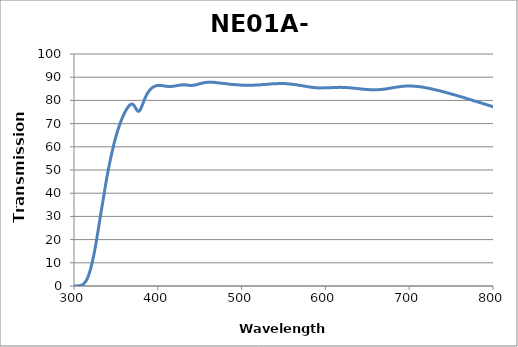
| Category | Series 0 |
|---|---|
| 850.0 | 72.008 |
| 849.0 | 72.01 |
| 848.0 | 72.136 |
| 847.0 | 72.237 |
| 846.0 | 72.364 |
| 845.0 | 72.419 |
| 844.0 | 72.605 |
| 843.0 | 72.618 |
| 842.0 | 72.792 |
| 841.0 | 72.93 |
| 840.0 | 72.947 |
| 839.0 | 73.055 |
| 838.0 | 73.143 |
| 837.0 | 73.235 |
| 836.0 | 73.36 |
| 835.0 | 73.478 |
| 834.0 | 73.596 |
| 833.0 | 73.716 |
| 832.0 | 73.806 |
| 831.0 | 73.865 |
| 830.0 | 74.009 |
| 829.0 | 74.136 |
| 828.0 | 74.208 |
| 827.0 | 74.345 |
| 826.0 | 74.465 |
| 825.0 | 74.571 |
| 824.0 | 74.636 |
| 823.0 | 74.772 |
| 822.0 | 74.839 |
| 821.0 | 74.987 |
| 820.0 | 75.114 |
| 819.0 | 75.181 |
| 818.0 | 75.324 |
| 817.0 | 75.419 |
| 816.0 | 75.488 |
| 815.0 | 75.642 |
| 814.0 | 75.739 |
| 813.0 | 75.859 |
| 812.0 | 75.975 |
| 811.0 | 76.096 |
| 810.0 | 76.162 |
| 809.0 | 76.309 |
| 808.0 | 76.4 |
| 807.0 | 76.532 |
| 806.0 | 76.663 |
| 805.0 | 76.728 |
| 804.0 | 76.86 |
| 803.0 | 76.959 |
| 802.0 | 77.062 |
| 801.0 | 77.198 |
| 800.0 | 77.286 |
| 799.0 | 77.39 |
| 798.0 | 77.491 |
| 797.0 | 77.641 |
| 796.0 | 77.725 |
| 795.0 | 77.826 |
| 794.0 | 77.989 |
| 793.0 | 78.068 |
| 792.0 | 78.208 |
| 791.0 | 78.32 |
| 790.0 | 78.408 |
| 789.0 | 78.537 |
| 788.0 | 78.647 |
| 787.0 | 78.751 |
| 786.0 | 78.88 |
| 785.0 | 79.005 |
| 784.0 | 79.091 |
| 783.0 | 79.21 |
| 782.0 | 79.334 |
| 781.0 | 79.436 |
| 780.0 | 79.555 |
| 779.0 | 79.66 |
| 778.0 | 79.718 |
| 777.0 | 79.887 |
| 776.0 | 79.963 |
| 775.0 | 80.111 |
| 774.0 | 80.223 |
| 773.0 | 80.343 |
| 772.0 | 80.422 |
| 771.0 | 80.528 |
| 770.0 | 80.68 |
| 769.0 | 80.766 |
| 768.0 | 80.894 |
| 767.0 | 81.004 |
| 766.0 | 81.084 |
| 765.0 | 81.231 |
| 764.0 | 81.326 |
| 763.0 | 81.448 |
| 762.0 | 81.546 |
| 761.0 | 81.656 |
| 760.0 | 81.72 |
| 759.0 | 81.859 |
| 758.0 | 81.979 |
| 757.0 | 82.059 |
| 756.0 | 82.19 |
| 755.0 | 82.285 |
| 754.0 | 82.372 |
| 753.0 | 82.506 |
| 752.0 | 82.585 |
| 751.0 | 82.677 |
| 750.0 | 82.809 |
| 749.0 | 82.908 |
| 748.0 | 82.965 |
| 747.0 | 83.098 |
| 746.0 | 83.2 |
| 745.0 | 83.304 |
| 744.0 | 83.394 |
| 743.0 | 83.504 |
| 742.0 | 83.563 |
| 741.0 | 83.697 |
| 740.0 | 83.787 |
| 739.0 | 83.881 |
| 738.0 | 83.991 |
| 737.0 | 84.072 |
| 736.0 | 84.13 |
| 735.0 | 84.246 |
| 734.0 | 84.344 |
| 733.0 | 84.411 |
| 732.0 | 84.512 |
| 731.0 | 84.571 |
| 730.0 | 84.654 |
| 729.0 | 84.765 |
| 728.0 | 84.846 |
| 727.0 | 84.927 |
| 726.0 | 84.991 |
| 725.0 | 85.121 |
| 724.0 | 85.166 |
| 723.0 | 85.266 |
| 722.0 | 85.301 |
| 721.0 | 85.352 |
| 720.0 | 85.443 |
| 719.0 | 85.499 |
| 718.0 | 85.54 |
| 717.0 | 85.629 |
| 716.0 | 85.719 |
| 715.0 | 85.758 |
| 714.0 | 85.832 |
| 713.0 | 85.846 |
| 712.0 | 85.867 |
| 711.0 | 85.945 |
| 710.0 | 85.987 |
| 709.0 | 86.017 |
| 708.0 | 86.056 |
| 707.0 | 86.073 |
| 706.0 | 86.09 |
| 705.0 | 86.139 |
| 704.0 | 86.165 |
| 703.0 | 86.174 |
| 702.0 | 86.202 |
| 701.0 | 86.189 |
| 700.0 | 86.199 |
| 699.0 | 86.218 |
| 698.0 | 86.214 |
| 697.0 | 86.192 |
| 696.0 | 86.171 |
| 695.0 | 86.153 |
| 694.0 | 86.103 |
| 693.0 | 86.088 |
| 692.0 | 86.085 |
| 691.0 | 86.032 |
| 690.0 | 86.012 |
| 689.0 | 85.972 |
| 688.0 | 85.895 |
| 687.0 | 85.817 |
| 686.0 | 85.801 |
| 685.0 | 85.763 |
| 684.0 | 85.689 |
| 683.0 | 85.618 |
| 682.0 | 85.544 |
| 681.0 | 85.48 |
| 680.0 | 85.443 |
| 679.0 | 85.391 |
| 678.0 | 85.294 |
| 677.0 | 85.252 |
| 676.0 | 85.172 |
| 675.0 | 85.101 |
| 674.0 | 85.051 |
| 673.0 | 85.001 |
| 672.0 | 84.953 |
| 671.0 | 84.881 |
| 670.0 | 84.826 |
| 669.0 | 84.791 |
| 668.0 | 84.773 |
| 667.0 | 84.746 |
| 666.0 | 84.693 |
| 665.0 | 84.66 |
| 664.0 | 84.633 |
| 663.0 | 84.608 |
| 662.0 | 84.607 |
| 661.0 | 84.587 |
| 660.0 | 84.558 |
| 659.0 | 84.601 |
| 658.0 | 84.588 |
| 657.0 | 84.563 |
| 656.0 | 84.592 |
| 655.0 | 84.601 |
| 654.0 | 84.607 |
| 653.0 | 84.633 |
| 652.0 | 84.64 |
| 651.0 | 84.68 |
| 650.0 | 84.729 |
| 649.0 | 84.706 |
| 648.0 | 84.726 |
| 647.0 | 84.796 |
| 646.0 | 84.803 |
| 645.0 | 84.825 |
| 644.0 | 84.883 |
| 643.0 | 84.92 |
| 642.0 | 84.941 |
| 641.0 | 84.988 |
| 640.0 | 85.023 |
| 639.0 | 85.06 |
| 638.0 | 85.125 |
| 637.0 | 85.16 |
| 636.0 | 85.19 |
| 635.0 | 85.242 |
| 634.0 | 85.248 |
| 633.0 | 85.282 |
| 632.0 | 85.35 |
| 631.0 | 85.374 |
| 630.0 | 85.407 |
| 629.0 | 85.459 |
| 628.0 | 85.455 |
| 627.0 | 85.482 |
| 626.0 | 85.532 |
| 625.0 | 85.555 |
| 624.0 | 85.581 |
| 623.0 | 85.583 |
| 622.0 | 85.582 |
| 621.0 | 85.592 |
| 620.0 | 85.601 |
| 619.0 | 85.617 |
| 618.0 | 85.623 |
| 617.0 | 85.628 |
| 616.0 | 85.595 |
| 615.0 | 85.569 |
| 614.0 | 85.593 |
| 613.0 | 85.573 |
| 612.0 | 85.554 |
| 611.0 | 85.569 |
| 610.0 | 85.536 |
| 609.0 | 85.518 |
| 608.0 | 85.537 |
| 607.0 | 85.495 |
| 606.0 | 85.481 |
| 605.0 | 85.496 |
| 604.0 | 85.441 |
| 603.0 | 85.423 |
| 602.0 | 85.446 |
| 601.0 | 85.422 |
| 600.0 | 85.431 |
| 599.0 | 85.424 |
| 598.0 | 85.405 |
| 597.0 | 85.385 |
| 596.0 | 85.407 |
| 595.0 | 85.39 |
| 594.0 | 85.381 |
| 593.0 | 85.396 |
| 592.0 | 85.384 |
| 591.0 | 85.396 |
| 590.0 | 85.459 |
| 589.0 | 85.461 |
| 588.0 | 85.491 |
| 587.0 | 85.531 |
| 586.0 | 85.535 |
| 585.0 | 85.585 |
| 584.0 | 85.66 |
| 583.0 | 85.677 |
| 582.0 | 85.722 |
| 581.0 | 85.799 |
| 580.0 | 85.832 |
| 579.0 | 85.883 |
| 578.0 | 85.957 |
| 577.0 | 86.028 |
| 576.0 | 86.105 |
| 575.0 | 86.148 |
| 574.0 | 86.203 |
| 573.0 | 86.259 |
| 572.0 | 86.341 |
| 571.0 | 86.391 |
| 570.0 | 86.425 |
| 569.0 | 86.518 |
| 568.0 | 86.565 |
| 567.0 | 86.592 |
| 566.0 | 86.701 |
| 565.0 | 86.731 |
| 564.0 | 86.787 |
| 563.0 | 86.874 |
| 562.0 | 86.877 |
| 561.0 | 86.936 |
| 560.0 | 86.936 |
| 559.0 | 87.012 |
| 558.0 | 87.068 |
| 557.0 | 87.072 |
| 556.0 | 87.129 |
| 555.0 | 87.156 |
| 554.0 | 87.146 |
| 553.0 | 87.181 |
| 552.0 | 87.22 |
| 551.0 | 87.24 |
| 550.0 | 87.257 |
| 549.0 | 87.272 |
| 548.0 | 87.257 |
| 547.0 | 87.255 |
| 546.0 | 87.303 |
| 545.0 | 87.277 |
| 544.0 | 87.265 |
| 543.0 | 87.265 |
| 542.0 | 87.197 |
| 541.0 | 87.211 |
| 540.0 | 87.219 |
| 539.0 | 87.199 |
| 538.0 | 87.209 |
| 537.0 | 87.151 |
| 536.0 | 87.121 |
| 535.0 | 87.085 |
| 534.0 | 87.084 |
| 533.0 | 87.076 |
| 532.0 | 87.012 |
| 531.0 | 86.983 |
| 530.0 | 86.935 |
| 529.0 | 86.888 |
| 528.0 | 86.916 |
| 527.0 | 86.873 |
| 526.0 | 86.844 |
| 525.0 | 86.821 |
| 524.0 | 86.733 |
| 523.0 | 86.731 |
| 522.0 | 86.733 |
| 521.0 | 86.657 |
| 520.0 | 86.645 |
| 519.0 | 86.649 |
| 518.0 | 86.588 |
| 517.0 | 86.617 |
| 516.0 | 86.603 |
| 515.0 | 86.552 |
| 514.0 | 86.56 |
| 513.0 | 86.537 |
| 512.0 | 86.525 |
| 511.0 | 86.48 |
| 510.0 | 86.561 |
| 509.0 | 86.511 |
| 508.0 | 86.525 |
| 507.0 | 86.541 |
| 506.0 | 86.483 |
| 505.0 | 86.542 |
| 504.0 | 86.596 |
| 503.0 | 86.516 |
| 502.0 | 86.585 |
| 501.0 | 86.569 |
| 500.0 | 86.569 |
| 499.0 | 86.624 |
| 498.0 | 86.694 |
| 497.0 | 86.647 |
| 496.0 | 86.708 |
| 495.0 | 86.74 |
| 494.0 | 86.716 |
| 493.0 | 86.745 |
| 492.0 | 86.841 |
| 491.0 | 86.801 |
| 490.0 | 86.902 |
| 489.0 | 86.896 |
| 488.0 | 86.896 |
| 487.0 | 86.977 |
| 486.0 | 87.018 |
| 485.0 | 86.999 |
| 484.0 | 87.107 |
| 483.0 | 87.105 |
| 482.0 | 87.15 |
| 481.0 | 87.186 |
| 480.0 | 87.265 |
| 479.0 | 87.258 |
| 478.0 | 87.325 |
| 477.0 | 87.38 |
| 476.0 | 87.383 |
| 475.0 | 87.435 |
| 474.0 | 87.51 |
| 473.0 | 87.541 |
| 472.0 | 87.561 |
| 471.0 | 87.637 |
| 470.0 | 87.628 |
| 469.0 | 87.685 |
| 468.0 | 87.788 |
| 467.0 | 87.732 |
| 466.0 | 87.831 |
| 465.0 | 87.796 |
| 464.0 | 87.784 |
| 463.0 | 87.819 |
| 462.0 | 87.828 |
| 461.0 | 87.829 |
| 460.0 | 87.785 |
| 459.0 | 87.814 |
| 458.0 | 87.714 |
| 457.0 | 87.705 |
| 456.0 | 87.675 |
| 455.0 | 87.584 |
| 454.0 | 87.537 |
| 453.0 | 87.447 |
| 452.0 | 87.354 |
| 451.0 | 87.246 |
| 450.0 | 87.196 |
| 449.0 | 87.053 |
| 448.0 | 86.99 |
| 447.0 | 86.904 |
| 446.0 | 86.742 |
| 445.0 | 86.727 |
| 444.0 | 86.612 |
| 443.0 | 86.545 |
| 442.0 | 86.518 |
| 441.0 | 86.488 |
| 440.0 | 86.434 |
| 439.0 | 86.427 |
| 438.0 | 86.516 |
| 437.0 | 86.46 |
| 436.0 | 86.574 |
| 435.0 | 86.61 |
| 434.0 | 86.602 |
| 433.0 | 86.626 |
| 432.0 | 86.729 |
| 431.0 | 86.652 |
| 430.0 | 86.708 |
| 429.0 | 86.703 |
| 428.0 | 86.606 |
| 427.0 | 86.643 |
| 426.0 | 86.562 |
| 425.0 | 86.474 |
| 424.0 | 86.466 |
| 423.0 | 86.374 |
| 422.0 | 86.347 |
| 421.0 | 86.269 |
| 420.0 | 86.178 |
| 419.0 | 86.137 |
| 418.0 | 86.076 |
| 417.0 | 86.048 |
| 416.0 | 86.033 |
| 415.0 | 85.968 |
| 414.0 | 85.992 |
| 413.0 | 85.956 |
| 412.0 | 85.986 |
| 411.0 | 86.051 |
| 410.0 | 86.083 |
| 409.0 | 86.146 |
| 408.0 | 86.187 |
| 407.0 | 86.24 |
| 406.0 | 86.31 |
| 405.0 | 86.405 |
| 404.0 | 86.422 |
| 403.0 | 86.473 |
| 402.0 | 86.45 |
| 401.0 | 86.421 |
| 400.0 | 86.432 |
| 399.0 | 86.38 |
| 398.0 | 86.324 |
| 397.0 | 86.164 |
| 396.0 | 86.029 |
| 395.0 | 85.834 |
| 394.0 | 85.628 |
| 393.0 | 85.357 |
| 392.0 | 85.073 |
| 391.0 | 84.673 |
| 390.0 | 84.273 |
| 389.0 | 83.814 |
| 388.0 | 83.206 |
| 387.0 | 82.611 |
| 386.0 | 81.889 |
| 385.0 | 81.125 |
| 384.0 | 80.334 |
| 383.0 | 79.393 |
| 382.0 | 78.457 |
| 381.0 | 77.548 |
| 380.0 | 76.71 |
| 379.0 | 75.981 |
| 378.0 | 75.468 |
| 377.0 | 75.277 |
| 376.0 | 75.416 |
| 375.0 | 75.829 |
| 374.0 | 76.381 |
| 373.0 | 77.022 |
| 372.0 | 77.594 |
| 371.0 | 78.029 |
| 370.0 | 78.31 |
| 369.0 | 78.437 |
| 368.0 | 78.295 |
| 367.0 | 78.114 |
| 366.0 | 77.78 |
| 365.0 | 77.337 |
| 364.0 | 76.885 |
| 363.0 | 76.35 |
| 362.0 | 75.713 |
| 361.0 | 75.085 |
| 360.0 | 74.352 |
| 359.0 | 73.565 |
| 358.0 | 72.774 |
| 357.0 | 71.913 |
| 356.0 | 70.944 |
| 355.0 | 70.009 |
| 354.0 | 69.001 |
| 353.0 | 67.938 |
| 352.0 | 66.828 |
| 351.0 | 65.648 |
| 350.0 | 64.377 |
| 349.0 | 63.064 |
| 348.0 | 61.644 |
| 347.0 | 60.141 |
| 346.0 | 58.664 |
| 345.0 | 57.102 |
| 344.0 | 55.453 |
| 343.0 | 53.779 |
| 342.0 | 52.011 |
| 341.0 | 50.189 |
| 340.0 | 48.283 |
| 339.0 | 46.308 |
| 338.0 | 44.225 |
| 337.0 | 42.106 |
| 336.0 | 39.953 |
| 335.0 | 37.765 |
| 334.0 | 35.585 |
| 333.0 | 33.388 |
| 332.0 | 31.176 |
| 331.0 | 28.935 |
| 330.0 | 26.671 |
| 329.0 | 24.437 |
| 328.0 | 22.214 |
| 327.0 | 20.033 |
| 326.0 | 17.938 |
| 325.0 | 15.945 |
| 324.0 | 14.049 |
| 323.0 | 12.274 |
| 322.0 | 10.612 |
| 321.0 | 9.062 |
| 320.0 | 7.636 |
| 319.0 | 6.335 |
| 318.0 | 5.193 |
| 317.0 | 4.21 |
| 316.0 | 3.34 |
| 315.0 | 2.608 |
| 314.0 | 2.008 |
| 313.0 | 1.515 |
| 312.0 | 1.116 |
| 311.0 | 0.8 |
| 310.0 | 0.557 |
| 309.0 | 0.376 |
| 308.0 | 0.249 |
| 307.0 | 0.158 |
| 306.0 | 0.099 |
| 305.0 | 0.059 |
| 304.0 | 0.032 |
| 303.0 | 0.018 |
| 302.0 | 0.011 |
| 301.0 | 0.006 |
| 300.0 | 0.003 |
| 299.0 | 0.001 |
| 298.0 | -0.002 |
| 297.0 | 0 |
| 296.0 | 0.001 |
| 295.0 | -0.001 |
| 294.0 | 0.002 |
| 293.0 | 0.001 |
| 292.0 | -0.002 |
| 291.0 | 0.002 |
| 290.0 | 0.003 |
| 289.0 | -0.002 |
| 288.0 | -0.002 |
| 287.0 | 0 |
| 286.0 | 0.001 |
| 285.0 | 0.001 |
| 284.0 | 0 |
| 283.0 | 0.001 |
| 282.0 | 0.001 |
| 281.0 | -0.001 |
| 280.0 | -0.003 |
| 279.0 | 0 |
| 278.0 | 0.002 |
| 277.0 | 0 |
| 276.0 | 0.002 |
| 275.0 | 0.001 |
| 274.0 | -0.001 |
| 273.0 | 0.002 |
| 272.0 | 0.002 |
| 271.0 | 0 |
| 270.0 | 0.002 |
| 269.0 | 0.001 |
| 268.0 | -0.002 |
| 267.0 | 0.001 |
| 266.0 | 0.001 |
| 265.0 | 0 |
| 264.0 | 0.002 |
| 263.0 | 0.001 |
| 262.0 | -0.001 |
| 261.0 | 0.001 |
| 260.0 | 0.001 |
| 259.0 | -0.001 |
| 258.0 | 0.001 |
| 257.0 | -0.001 |
| 256.0 | -0.001 |
| 255.0 | 0 |
| 254.0 | -0.002 |
| 253.0 | -0.001 |
| 252.0 | 0.003 |
| 251.0 | 0.002 |
| 250.0 | 0 |
| 249.0 | 0.002 |
| 248.0 | 0 |
| 247.0 | 0 |
| 246.0 | 0.002 |
| 245.0 | -0.001 |
| 244.0 | -0.003 |
| 243.0 | -0.001 |
| 242.0 | -0.002 |
| 241.0 | 0 |
| 240.0 | 0.003 |
| 239.0 | 0 |
| 238.0 | -0.002 |
| 237.0 | -0.001 |
| 236.0 | -0.001 |
| 235.0 | 0 |
| 234.0 | 0.002 |
| 233.0 | 0 |
| 232.0 | -0.002 |
| 231.0 | 0.001 |
| 230.0 | -0.001 |
| 229.0 | 0 |
| 228.0 | 0.003 |
| 227.0 | 0.001 |
| 226.0 | -0.001 |
| 225.0 | -0.001 |
| 224.0 | -0.002 |
| 223.0 | 0 |
| 222.0 | 0.002 |
| 221.0 | 0.001 |
| 220.0 | -0.001 |
| 219.0 | 0 |
| 218.0 | -0.001 |
| 217.0 | 0 |
| 216.0 | 0.002 |
| 215.0 | 0 |
| 214.0 | -0.001 |
| 213.0 | 0 |
| 212.0 | -0.002 |
| 211.0 | 0.001 |
| 210.0 | 0.002 |
| 209.0 | 0 |
| 208.0 | -0.003 |
| 207.0 | 0.001 |
| 206.0 | 0 |
| 205.0 | -0.002 |
| 204.0 | 0 |
| 203.0 | -0.001 |
| 202.0 | 0 |
| 201.0 | 0 |
| 200.0 | -0.004 |